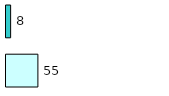
| Category | Series 0 | Series 1 |
|---|---|---|
| 0 | 55 | 8 |